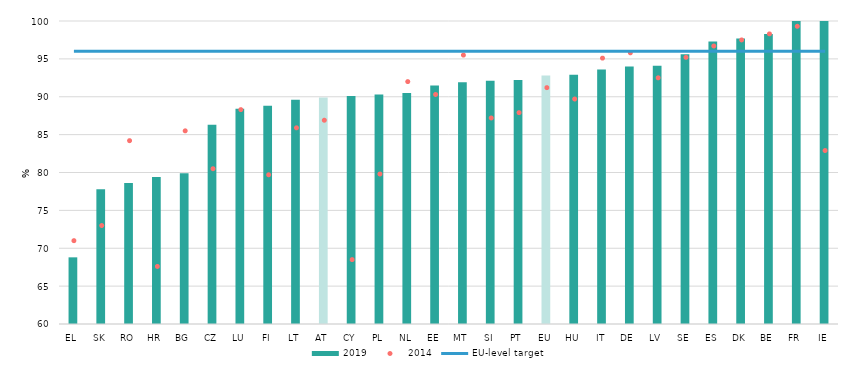
| Category | 2019 |
|---|---|
| EL | 68.8 |
| SK | 77.8 |
| RO | 78.6 |
| HR | 79.4 |
| BG | 79.9 |
| CZ | 86.3 |
| LU | 88.4 |
| FI | 88.8 |
| LT | 89.6 |
| AT | 89.9 |
| CY | 90.1 |
| PL | 90.3 |
| NL | 90.5 |
| EE | 91.5 |
| MT | 91.9 |
| SI | 92.1 |
| PT | 92.2 |
| EU | 92.8 |
| HU | 92.9 |
| IT | 93.6 |
| DE | 94 |
| LV | 94.1 |
| SE | 95.6 |
| ES | 97.3 |
| DK | 97.7 |
| BE | 98.3 |
| FR | 100 |
| IE | 100 |